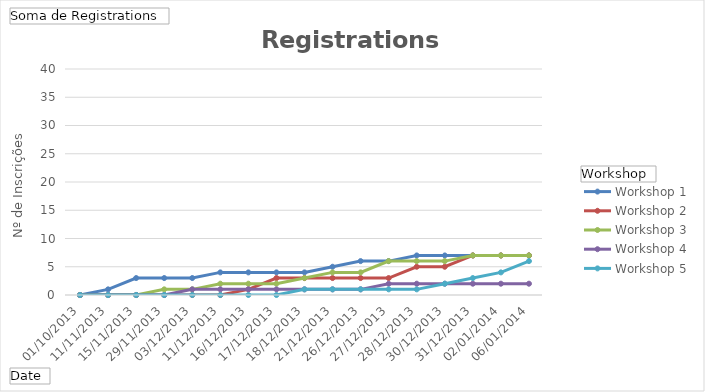
| Category | Workshop 1 | Workshop 2 | Workshop 3 | Workshop 4 | Workshop 5 |
|---|---|---|---|---|---|
| 01/10/2013 | 0 | 0 | 0 | 0 | 0 |
| 11/11/2013 | 1 | 0 | 0 | 0 | 0 |
| 15/11/2013 | 3 | 0 | 0 | 0 | 0 |
| 29/11/2013 | 3 | 0 | 1 | 0 | 0 |
| 03/12/2013 | 3 | 0 | 1 | 1 | 0 |
| 11/12/2013 | 4 | 0 | 2 | 1 | 0 |
| 16/12/2013 | 4 | 1 | 2 | 1 | 0 |
| 17/12/2013 | 4 | 3 | 2 | 1 | 0 |
| 18/12/2013 | 4 | 3 | 3 | 1 | 1 |
| 21/12/2013 | 5 | 3 | 4 | 1 | 1 |
| 26/12/2013 | 6 | 3 | 4 | 1 | 1 |
| 27/12/2013 | 6 | 3 | 6 | 2 | 1 |
| 28/12/2013 | 7 | 5 | 6 | 2 | 1 |
| 30/12/2013 | 7 | 5 | 6 | 2 | 2 |
| 31/12/2013 | 7 | 7 | 7 | 2 | 3 |
| 02/01/2014 | 7 | 7 | 7 | 2 | 4 |
| 06/01/2014 | 7 | 7 | 7 | 2 | 6 |